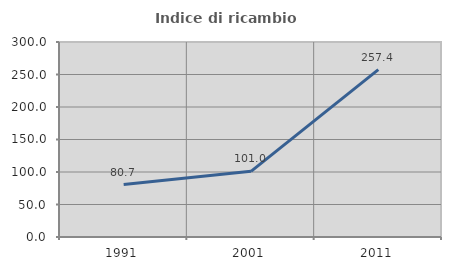
| Category | Indice di ricambio occupazionale  |
|---|---|
| 1991.0 | 80.711 |
| 2001.0 | 101.042 |
| 2011.0 | 257.396 |